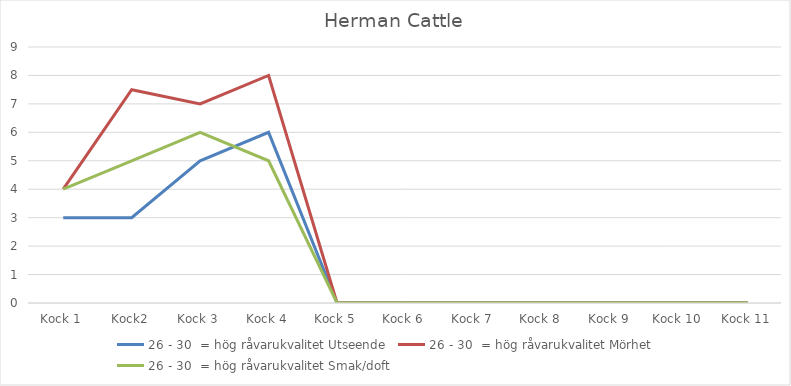
| Category | 26 - 30  = hög råvarukvalitet Utseende | 26 - 30  = hög råvarukvalitet Mörhet | 26 - 30  = hög råvarukvalitet Smak/doft |
|---|---|---|---|
| Kock 1 | 3 | 4 | 4 |
| Kock2 | 3 | 7.5 | 5 |
| Kock 3 | 5 | 7 | 6 |
| Kock 4 | 6 | 8 | 5 |
| Kock 5 | 0 | 0 | 0 |
| Kock 6 | 0 | 0 | 0 |
| Kock 7 | 0 | 0 | 0 |
| Kock 8 | 0 | 0 | 0 |
| Kock 9 | 0 | 0 | 0 |
| Kock 10 | 0 | 0 | 0 |
| Kock 11 | 0 | 0 | 0 |